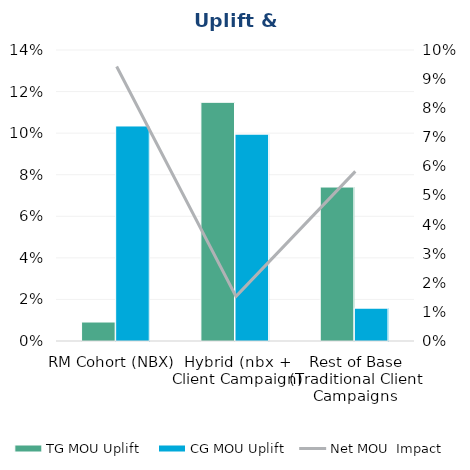
| Category | TG MOU Uplift  | CG MOU Uplift |
|---|---|---|
| RM Cohort (NBX)  | 0.009 | 0.103 |
| Hybrid (nbx + Client Campaign) | 0.115 | 0.1 |
| Rest of Base (Traditional Client Campaigns | 0.074 | 0.016 |